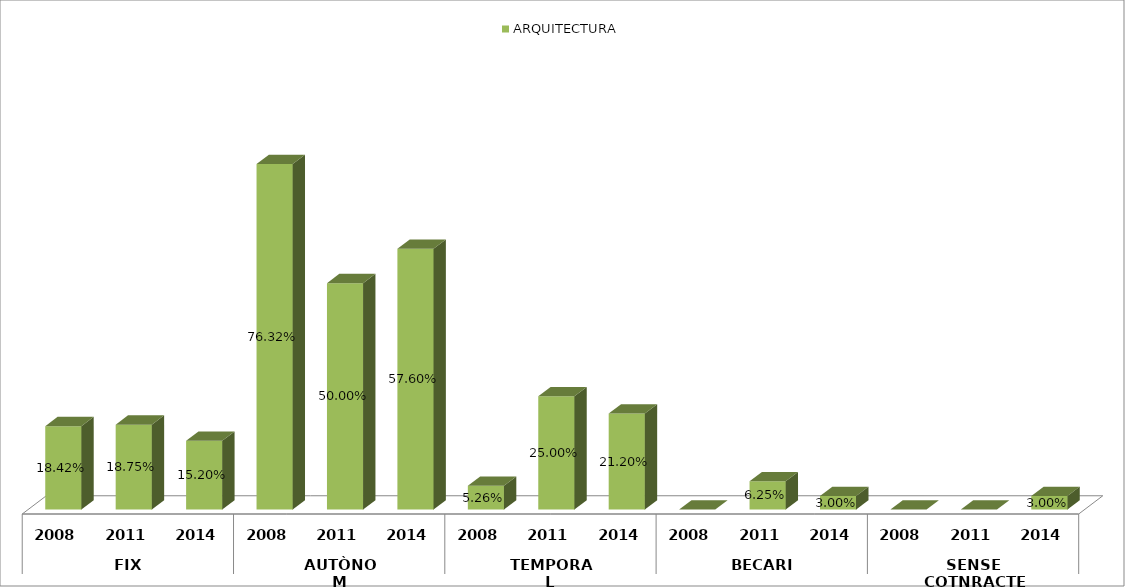
| Category | ARQUITECTURA |
|---|---|
| 0 | 0.184 |
| 1 | 0.188 |
| 2 | 0.152 |
| 3 | 0.763 |
| 4 | 0.5 |
| 5 | 0.576 |
| 6 | 0.053 |
| 7 | 0.25 |
| 8 | 0.212 |
| 9 | 0 |
| 10 | 0.062 |
| 11 | 0.03 |
| 12 | 0 |
| 13 | 0 |
| 14 | 0.03 |